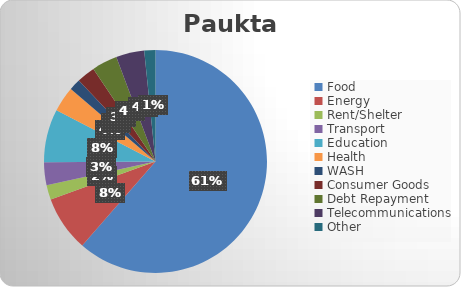
| Category | Series 0 |
|---|---|
| Food  | 179666.667 |
| Energy | 23533.333 |
| Rent/Shelter | 6266.667 |
| Transport | 9677.778 |
| Education | 22544.444 |
| Health | 10722.222 |
| WASH | 4855.556 |
| Consumer Goods | 7800 |
| Debt Repayment | 10778.667 |
| Telecommunications | 12000 |
| Other  | 4733.333 |